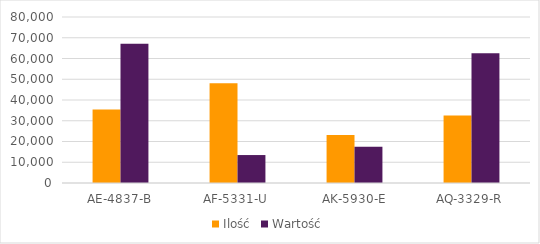
| Category | Ilość | Wartość |
|---|---|---|
| AE-4837-B | 35367 | 67137 |
| AF-5331-U | 48019 | 13470 |
| AK-5930-E | 23121 | 17471 |
| AQ-3329-R | 32568 | 62564 |